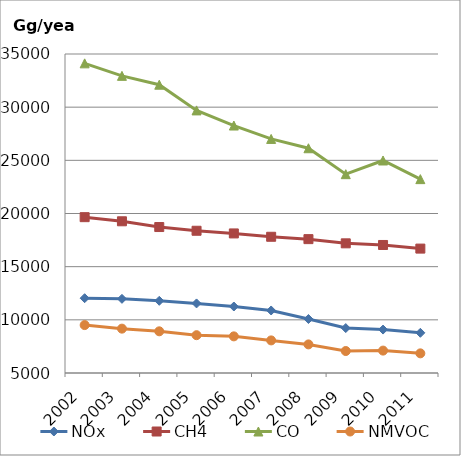
| Category | NOx | CH4 | CO | NMVOC |
|---|---|---|---|---|
| 2002 | 12034.596 | 19655.626 | 34120.548 | 9507.433 |
| 2003 | 11974.911 | 19267.631 | 32945.068 | 9171.704 |
| 2004 | 11790.119 | 18726.71 | 32111.765 | 8920.986 |
| 2005 | 11542.109 | 18376.932 | 29696.165 | 8556.162 |
| 2006 | 11253.176 | 18125.05 | 28272.253 | 8445.575 |
| 2007 | 10880.418 | 17811.683 | 27012.648 | 8065.962 |
| 2008 | 10076.96 | 17588.908 | 26137.021 | 7689.212 |
| 2009 | 9225.041 | 17194.062 | 23698.012 | 7067.24 |
| 2010 | 9084.261 | 17039.627 | 24984.579 | 7106.753 |
| 2011 | 8780.317 | 16699.362 | 23231.704 | 6848.273 |